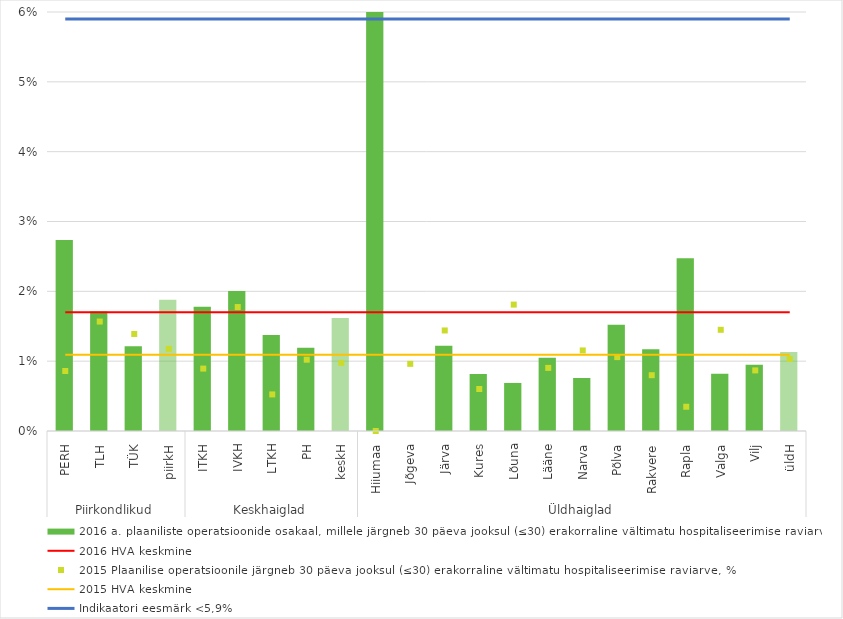
| Category | 2016 a. plaaniliste operatsioonide osakaal, millele järgneb 30 päeva jooksul (≤30) erakorraline vältimatu hospitaliseerimise raviarve |
|---|---|
| 0 | 0.027 |
| 1 | 0.017 |
| 2 | 0.012 |
| 3 | 0.019 |
| 4 | 0.018 |
| 5 | 0.02 |
| 6 | 0.014 |
| 7 | 0.012 |
| 8 | 0.016 |
| 9 | 0.062 |
| 10 | 0 |
| 11 | 0.012 |
| 12 | 0.008 |
| 13 | 0.007 |
| 14 | 0.01 |
| 15 | 0.008 |
| 16 | 0.015 |
| 17 | 0.012 |
| 18 | 0.025 |
| 19 | 0.008 |
| 20 | 0.01 |
| 21 | 0.011 |